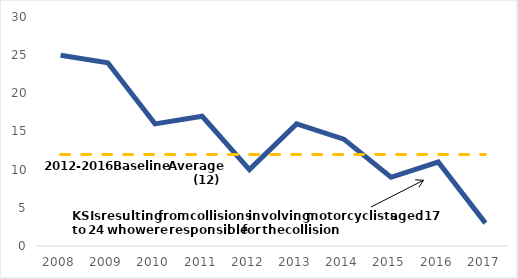
| Category | Series 0 | Series 1 |
|---|---|---|
| 2008.0 | 25 | 12 |
| 2009.0 | 24 | 12 |
| 2010.0 | 16 | 12 |
| 2011.0 | 17 | 12 |
| 2012.0 | 10 | 12 |
| 2013.0 | 16 | 12 |
| 2014.0 | 14 | 12 |
| 2015.0 | 9 | 12 |
| 2016.0 | 11 | 12 |
| 2017.0 | 3 | 12 |